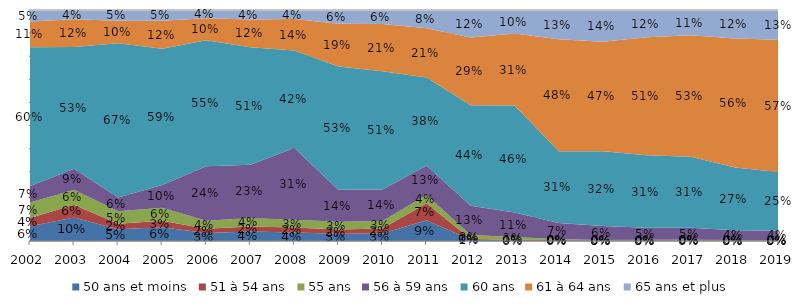
| Category | 50 ans et moins | 51 à 54 ans | 55 ans | 56 à 59 ans | 60 ans | 61 à 64 ans | 65 ans et plus |
|---|---|---|---|---|---|---|---|
| 2002.0 | 0.064 | 0.036 | 0.067 | 0.072 | 0.601 | 0.112 | 0.049 |
| 2003.0 | 0.101 | 0.056 | 0.065 | 0.091 | 0.527 | 0.12 | 0.04 |
| 2004.0 | 0.051 | 0.024 | 0.054 | 0.06 | 0.668 | 0.097 | 0.047 |
| 2005.0 | 0.06 | 0.028 | 0.056 | 0.098 | 0.59 | 0.122 | 0.046 |
| 2006.0 | 0.034 | 0.018 | 0.035 | 0.236 | 0.545 | 0.096 | 0.035 |
| 2007.0 | 0.041 | 0.022 | 0.037 | 0.231 | 0.509 | 0.12 | 0.041 |
| 2008.0 | 0.036 | 0.022 | 0.034 | 0.311 | 0.422 | 0.136 | 0.039 |
| 2009.0 | 0.031 | 0.018 | 0.034 | 0.139 | 0.534 | 0.185 | 0.059 |
| 2010.0 | 0.033 | 0.022 | 0.032 | 0.137 | 0.511 | 0.205 | 0.06 |
| 2011.0 | 0.09 | 0.073 | 0.035 | 0.129 | 0.381 | 0.213 | 0.079 |
| 2012.0 | 0.005 | 0.004 | 0.016 | 0.127 | 0.435 | 0.293 | 0.119 |
| 2013.0 | 0.003 | 0.002 | 0.012 | 0.106 | 0.463 | 0.312 | 0.102 |
| 2014.0 | 0.002 | 0.003 | 0.003 | 0.07 | 0.311 | 0.485 | 0.127 |
| 2015.0 | 0.001 | 0.001 | 0.002 | 0.06 | 0.324 | 0.474 | 0.137 |
| 2016.0 | 0.001 | 0.002 | 0.002 | 0.051 | 0.315 | 0.511 | 0.118 |
| 2017.0 | 0.001 | 0.003 | 0.002 | 0.052 | 0.307 | 0.527 | 0.109 |
| 2018.0 | 0.001 | 0.002 | 0.002 | 0.043 | 0.272 | 0.558 | 0.123 |
| 2019.0 | 0.001 | 0.002 | 0.001 | 0.04 | 0.254 | 0.573 | 0.128 |